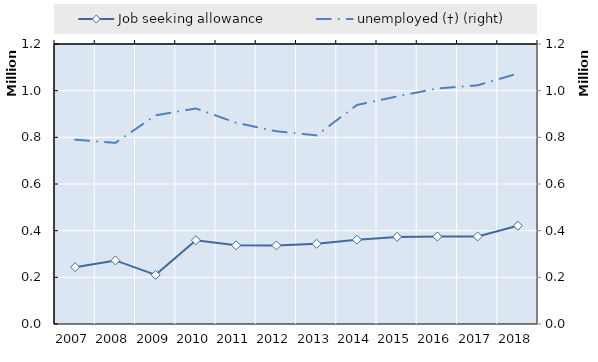
| Category | Series 4 | Series 5 | Series 6 | Series 7 | Series 8 | Series 9 | Series 10 | Series 11 | Series 12 | Series 13 | Series 14 | Series 15 | Series 16 | Series 17 | Series 18 | Series 19 | Job seeking allowance |
|---|---|---|---|---|---|---|---|---|---|---|---|---|---|---|---|---|---|
| 2007.0 |  |  |  |  |  |  |  |  |  |  |  |  |  |  |  |  | 243440 |
| 2008.0 |  |  |  |  |  |  |  |  |  |  |  |  |  |  |  |  | 272509 |
| 2009.0 |  |  |  |  |  |  |  |  |  |  |  |  |  |  |  |  | 210569 |
| 2010.0 |  |  |  |  |  |  |  |  |  |  |  |  |  |  |  |  | 359179 |
| 2011.0 |  |  |  |  |  |  |  |  |  |  |  |  |  |  |  |  | 337084 |
| 2012.0 |  |  |  |  |  |  |  |  |  |  |  |  |  |  |  |  | 336823 |
| 2013.0 |  |  |  |  |  |  |  |  |  |  |  |  |  |  |  |  | 343771 |
| 2014.0 |  |  |  |  |  |  |  |  |  |  |  |  |  |  |  |  | 361415 |
| 2015.0 |  |  |  |  |  |  |  |  |  |  |  |  |  |  |  |  | 373272 |
| 2016.0 |  |  |  |  |  |  |  |  |  |  |  |  |  |  |  |  | 374656 |
| 2017.0 |  |  |  |  |  |  |  |  |  |  |  |  |  |  |  |  | 375243 |
| 2018.0 |  |  |  |  |  |  |  |  |  |  |  |  |  |  |  |  | 421455 |